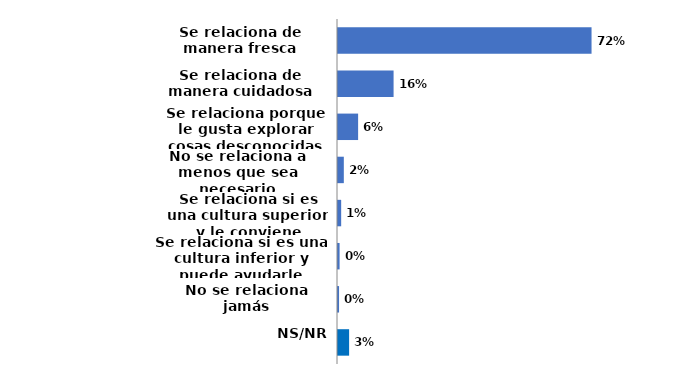
| Category | Series 0 |
|---|---|
| Se relaciona de manera fresca | 0.72 |
| Se relaciona de manera cuidadosa | 0.158 |
| Se relaciona porque le gusta explorar cosas desconocidas | 0.057 |
| No se relaciona a menos que sea necesario | 0.017 |
| Se relaciona si es una cultura superior y le conviene | 0.009 |
| Se relaciona si es una cultura inferior y puede ayudarle | 0.005 |
| No se relaciona jamás | 0.003 |
| NS/NR | 0.032 |